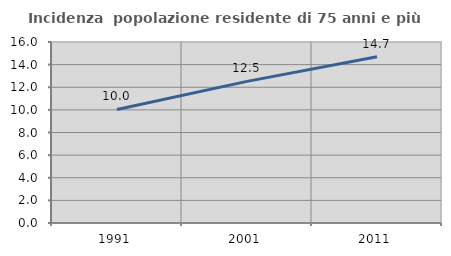
| Category | Incidenza  popolazione residente di 75 anni e più |
|---|---|
| 1991.0 | 10.033 |
| 2001.0 | 12.521 |
| 2011.0 | 14.7 |